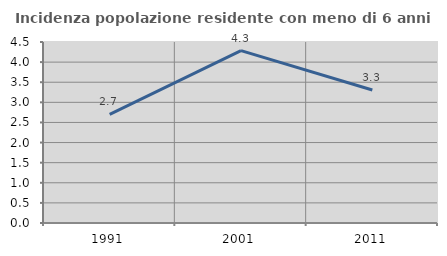
| Category | Incidenza popolazione residente con meno di 6 anni |
|---|---|
| 1991.0 | 2.703 |
| 2001.0 | 4.286 |
| 2011.0 | 3.306 |